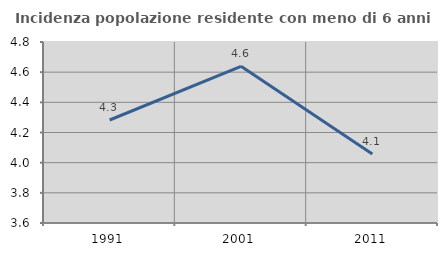
| Category | Incidenza popolazione residente con meno di 6 anni |
|---|---|
| 1991.0 | 4.283 |
| 2001.0 | 4.639 |
| 2011.0 | 4.057 |